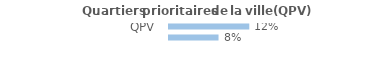
| Category | Series 0 |
|---|---|
| QPV | 0.125 |
| Hors QPV | 0.077 |